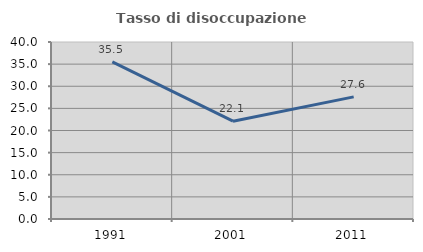
| Category | Tasso di disoccupazione giovanile  |
|---|---|
| 1991.0 | 35.492 |
| 2001.0 | 22.102 |
| 2011.0 | 27.597 |